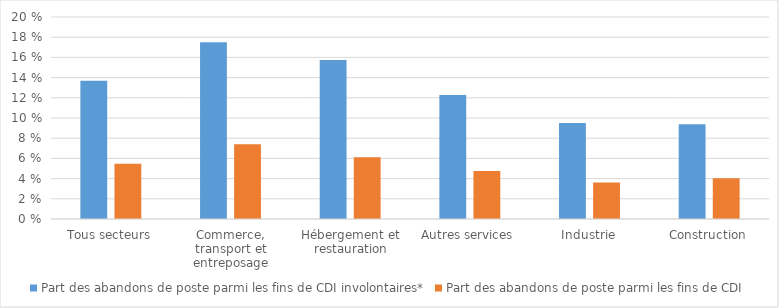
| Category | Part des abandons de poste parmi les fins de CDI involontaires* | Part des abandons de poste parmi les fins de CDI |
|---|---|---|
| Tous secteurs | 0.137 | 0.055 |
| Commerce, transport et entreposage | 0.175 | 0.074 |
| Hébergement et restauration | 0.157 | 0.061 |
| Autres services | 0.123 | 0.048 |
| Industrie | 0.095 | 0.036 |
| Construction | 0.094 | 0.04 |